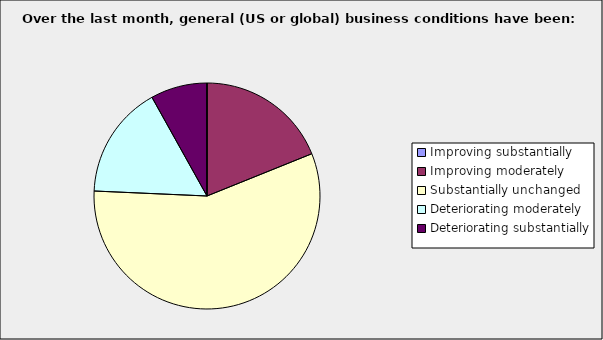
| Category | Series 0 |
|---|---|
| Improving substantially | 0 |
| Improving moderately | 0.189 |
| Substantially unchanged | 0.568 |
| Deteriorating moderately | 0.162 |
| Deteriorating substantially | 0.081 |